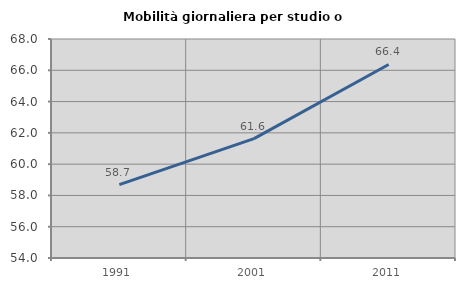
| Category | Mobilità giornaliera per studio o lavoro |
|---|---|
| 1991.0 | 58.692 |
| 2001.0 | 61.634 |
| 2011.0 | 66.374 |